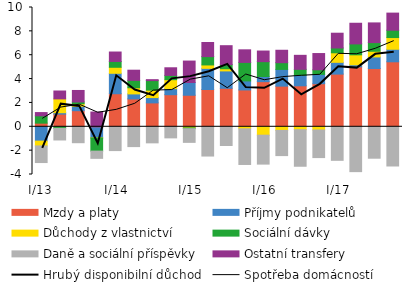
| Category | Mzdy a platy | Příjmy podnikatelů | Důchody z vlastnictví | Sociální dávky  | Daně a sociální příspěvky | Ostatní transfery |
|---|---|---|---|---|---|---|
| I/13 | 0.304 | -1.202 | -0.401 | 0.615 | -1.395 | 0.272 |
| II | 1.062 | 0.118 | 1.159 | -0.131 | -0.974 | 0.661 |
| III | 1.348 | 0.371 | 0.212 | 0.15 | -1.334 | 0.963 |
|  IV | -0.071 | -0.861 | -0.007 | -1.099 | -0.606 | 1.237 |
|  I/14 | 2.771 | 1.713 | 0.504 | 0.489 | -1.995 | 0.791 |
| II | 2.338 | 0.418 | 0.516 | 0.619 | -1.661 | 0.853 |
| III | 2.003 | 0.446 | 0.622 | 0.801 | -1.346 | 0.078 |
| IV | 2.689 | 0.515 | 0.744 | 0.361 | -0.929 | 0.639 |
|  I/15 | 2.644 | 1.067 | -0.091 | -0.068 | -1.147 | 1.798 |
| II | 3.127 | 1.772 | 0.285 | 0.699 | -2.453 | 1.182 |
| III | 3.227 | 1.458 | 0.18 | 0.346 | -1.568 | 1.587 |
| IV | 3.087 | 0.757 | -0.172 | 1.551 | -2.987 | 1.055 |
|  I/16 | 3.785 | 0.432 | -0.704 | 1.245 | -2.425 | 0.889 |
| II | 3.407 | 1.403 | -0.302 | 0.565 | -2.114 | 1.041 |
| III | 3.435 | 0.882 | -0.244 | 0.5 | -3.064 | 1.173 |
| IV | 3.61 | 0.786 | -0.267 | 0.381 | -2.316 | 1.363 |
|  I/17 | 4.418 | 0.985 | 0.8 | 0.403 | -2.812 | 1.238 |
| II | 5.026 | 0.173 | 0.835 | 0.916 | -3.76 | 1.73 |
| III | 4.883 | 0.974 | 0.472 | 0.729 | -2.634 | 1.65 |
| IV | 5.449 | 1.051 | 0.981 | 0.615 | -3.286 | 1.435 |